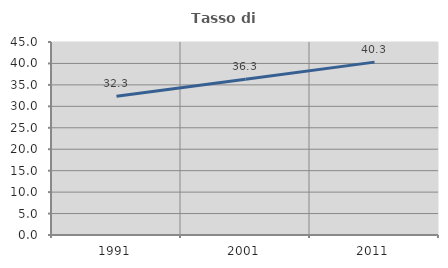
| Category | Tasso di occupazione   |
|---|---|
| 1991.0 | 32.331 |
| 2001.0 | 36.29 |
| 2011.0 | 40.31 |